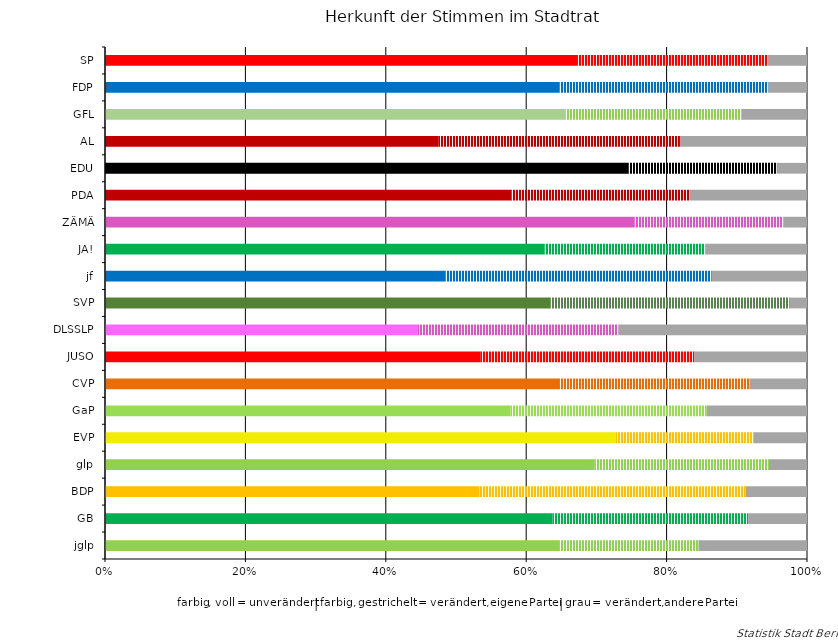
| Category | Series 0 | Series 1 | Series 2 |
|---|---|---|---|
| SP | 578720 | 233582 | 48293 |
| FDP | 190800 | 87539 | 16384 |
| GFL | 214320 | 82053 | 30456 |
| AL | 54080 | 39104 | 20589 |
| EDU | 14880 | 4215 | 863 |
| PDA | 28000 | 12250 | 8100 |
| ZÄMÄ | 17520 | 4932 | 780 |
| JA! | 79520 | 29081 | 18396 |
| jf | 18240 | 14252 | 5101 |
| SVP | 190080 | 102251 | 7363 |
| DLSSLP | 5200 | 3343 | 3142 |
| JUSO | 56000 | 31953 | 16799 |
| CVP | 72560 | 30219 | 9186 |
| GaP | 26240 | 12721 | 6484 |
| EVP | 61520 | 16586 | 6459 |
| glp | 257600 | 91921 | 20058 |
| BDP | 44800 | 31853 | 7320 |
| GB | 291600 | 127514 | 38342 |
| jglp | 59600 | 18285 | 14243 |